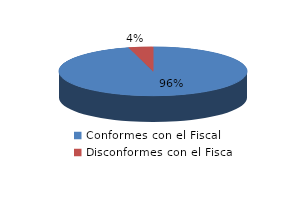
| Category | Series 0 |
|---|---|
| 0 | 23 |
| 1 | 1 |